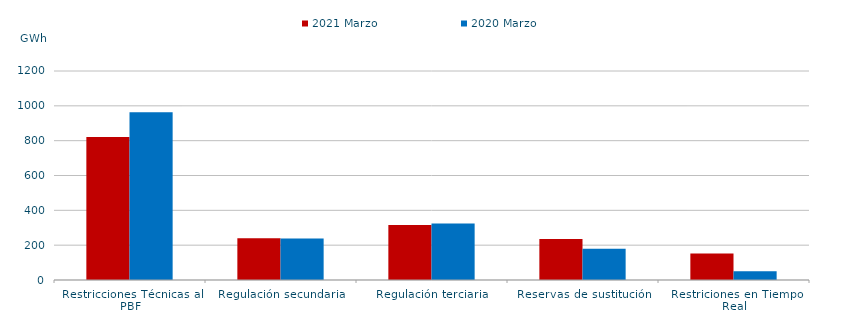
| Category | 2021 Marzo | 2020 Marzo |
|---|---|---|
| Restricciones Técnicas al PBF | 820.863 | 963.457 |
| Regulación secundaria | 239.951 | 238.354 |
| Regulación terciaria | 316.463 | 324.352 |
| Reservas de sustitución | 235.014 | 179.25 |
| Restriciones en Tiempo Real | 152.242 | 50.219 |